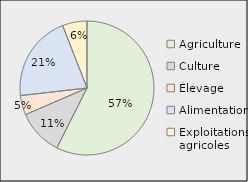
| Category | Series 0 |
|---|---|
| Agriculture | 0.574 |
| Culture | 0.111 |
| Élevage | 0.047 |
| Alimentation | 0.209 |
| Exploitations agricoles | 0.059 |